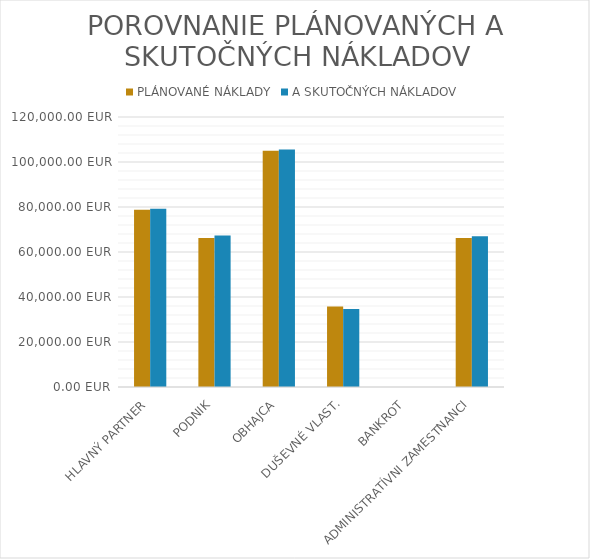
| Category | PLÁNOVANÉ NÁKLADY | A SKUTOČNÝCH NÁKLADOV |
|---|---|---|
| HLAVNÝ PARTNER | 78750 | 79275 |
| PODNIK | 66250 | 67375 |
| OBHAJCA | 105000 | 105600 |
| DUŠEVNÉ VLAST. | 35750 | 34650 |
| BANKROT | 0 | 0 |
| ADMINISTRATÍVNI ZAMESTNANCI | 66250 | 67000 |